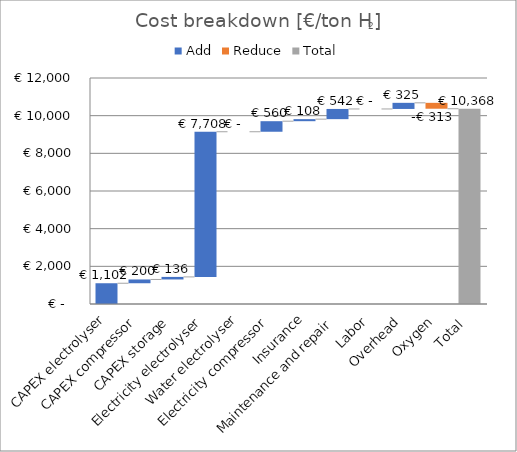
| Category | Electricity electrolyser | Water electrolyser | Electricity compressor | Oxygen production  |
|---|---|---|---|---|
| 0 | 13764.045 | 2.974 | 1000 | -4100.034 |